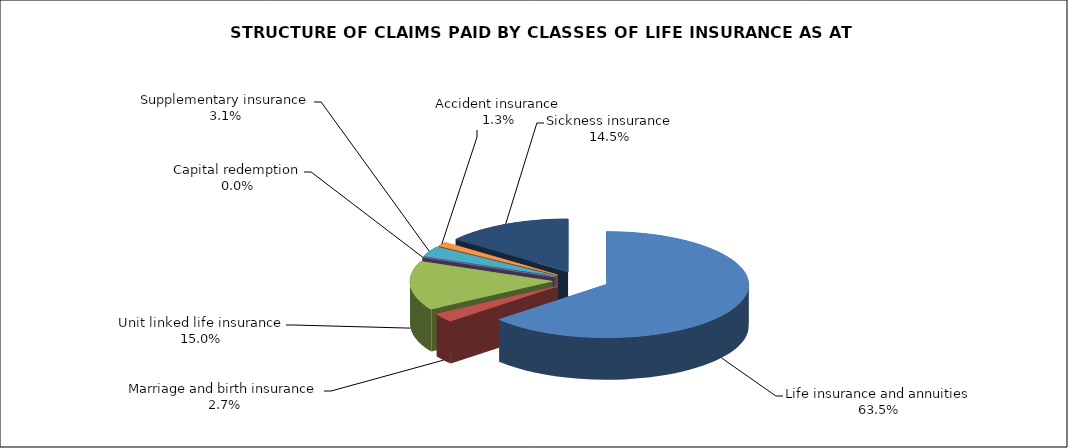
| Category | Life insurance and annuities |
|---|---|
| Life insurance and annuities | 124800805.656 |
| Marriage and birth insurance | 5207192.447 |
| Unit linked life insurance | 29414784.968 |
| Capital redemption | 0 |
| Supplementary insurance | 6109261.785 |
| Accident insurance | 2493807.742 |
| Sickness insurance | 28446213.883 |